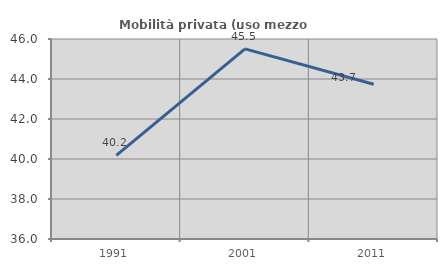
| Category | Mobilità privata (uso mezzo privato) |
|---|---|
| 1991.0 | 40.177 |
| 2001.0 | 45.508 |
| 2011.0 | 43.734 |